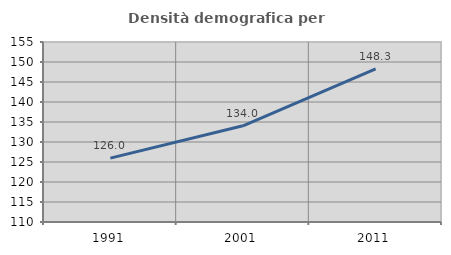
| Category | Densità demografica |
|---|---|
| 1991.0 | 125.971 |
| 2001.0 | 134.042 |
| 2011.0 | 148.311 |